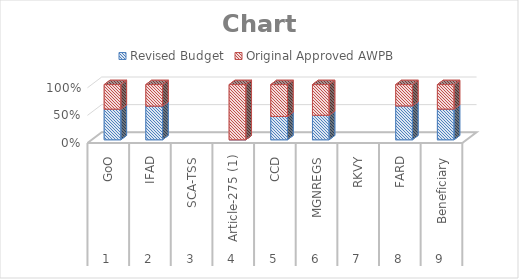
| Category | Revised Budget | Original Approved AWPB |
|---|---|---|
| 0 | 235463079.7 | 189059909.7 |
| 1 | 1056976029.6 | 673803299.6 |
| 2 | 0 | 0 |
| 3 | 0 | 10900000 |
| 4 | 151929935 | 207929935 |
| 5 | 200340000 | 250900000 |
| 6 | 0 | 0 |
| 7 | 90228750 | 56838750 |
| 8 | 58258796.7 | 46516436.7 |